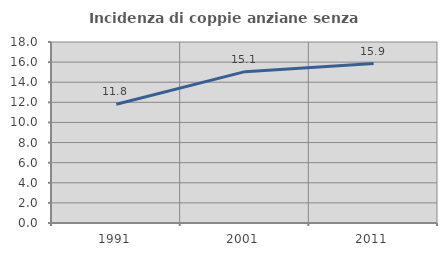
| Category | Incidenza di coppie anziane senza figli  |
|---|---|
| 1991.0 | 11.816 |
| 2001.0 | 15.051 |
| 2011.0 | 15.855 |